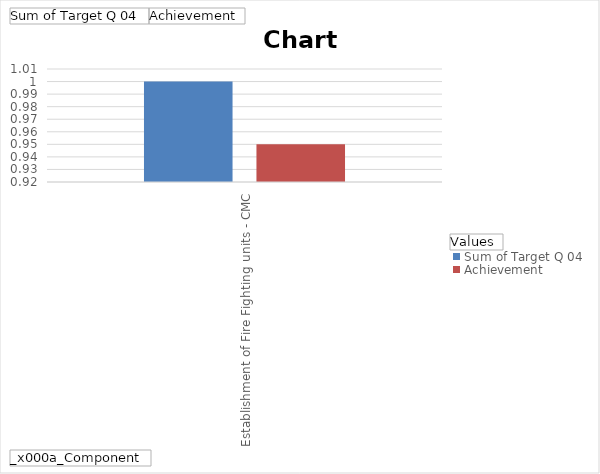
| Category | Sum of Target Q 04 | Achievement |
|---|---|---|
| Establishment of Fire Fighting units - CMC | 1 | 0.95 |